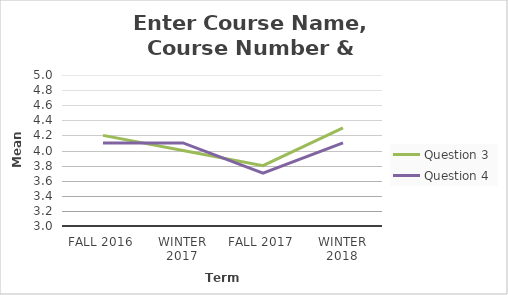
| Category | Question 3 | Question 4 |
|---|---|---|
| Fall 2016 | 4.2 | 4.1 |
| Winter 2017 | 4 | 4.1 |
| Fall 2017 | 3.8 | 3.7 |
| Winter 2018 | 4.3 | 4.1 |